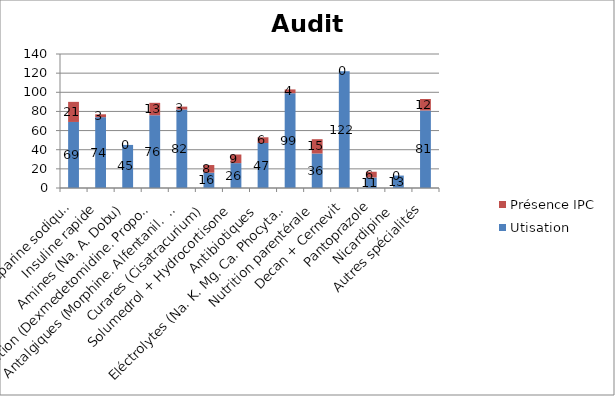
| Category | Utisation | Présence IPC |
|---|---|---|
| Héparine sodique  | 69 | 21 |
| Insuline rapide | 74 | 3 |
| Amines (Na. A. Dobu) | 45 | 0 |
| Sédation (Dexmedetomidine. Propofol. Midazolam) | 76 | 13 |
| Antalgiques (Morphine. Alfentanil.  Sufentanyl. Rémifentanyl. Nefopam) | 82 | 3 |
| Curares (Cisatracurium) | 16 | 8 |
| Solumedrol + Hydrocortisone | 26 | 9 |
| Antibiotiques  | 47 | 6 |
| Eléctrolytes (Na. K. Mg. Ca. Phocytan)  | 99 | 4 |
| Nutrition parentérale | 36 | 15 |
| Decan + Cernevit | 122 | 0 |
| Pantoprazole | 11 | 6 |
| Nicardipine  | 13 | 0 |
| Autres spécialités | 81 | 12 |